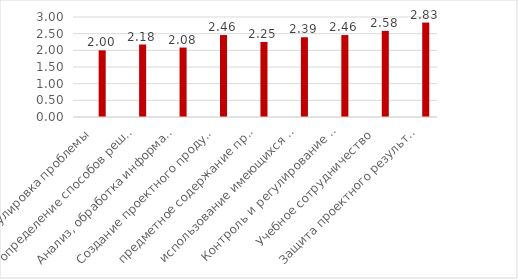
| Category | Series 0 | Series 1 | Series 2 |
|---|---|---|---|
| Формулировка проблемы |  |  | 2 |
| определение способов решения проблемы  |  |  | 2.175 |
| Анализ, обработка информации |  |  | 2.083 |
| Создание проектного продукта |  |  | 2.458 |
| предметное содержание проекта  |  |  | 2.25 |
| использование имеющихся способов |  |  | 2.392 |
| Контроль и регулирование проектной де |  |  | 2.458 |
| Учебное сотрудничество |  |  | 2.583 |
| Защита проектного результата |  |  | 2.833 |